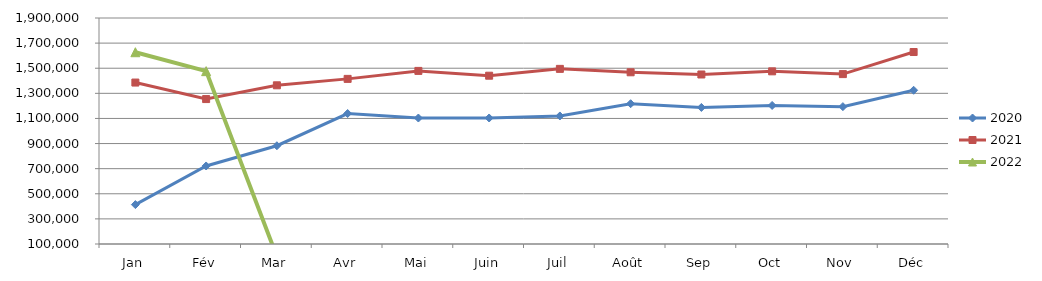
| Category | 2020 | 2021 | 2022 |
|---|---|---|---|
| Jan | 413718.973 | 1385841.188 | 1627456.472 |
| Fév | 721421.241 | 1254294.981 | 1476666.108 |
| Mar | 882604.122 | 1363936.74 | 0 |
| Avr | 1139215.204 | 1415132.587 | 0 |
| Mai | 1103343.599 | 1478708.989 | 0 |
| Juin | 1103576.761 | 1440368.873 | 0 |
| Juil | 1119722.736 | 1494841.171 | 0 |
| Août | 1217354.798 | 1467575.235 | 0 |
| Sep | 1187669.872 | 1450120.701 | 0 |
| Oct | 1203449.934 | 1475187.371 | 0 |
| Nov | 1194014.644 | 1453215.071 | 0 |
| Déc | 1324311.651 | 1629008.122 | 0 |